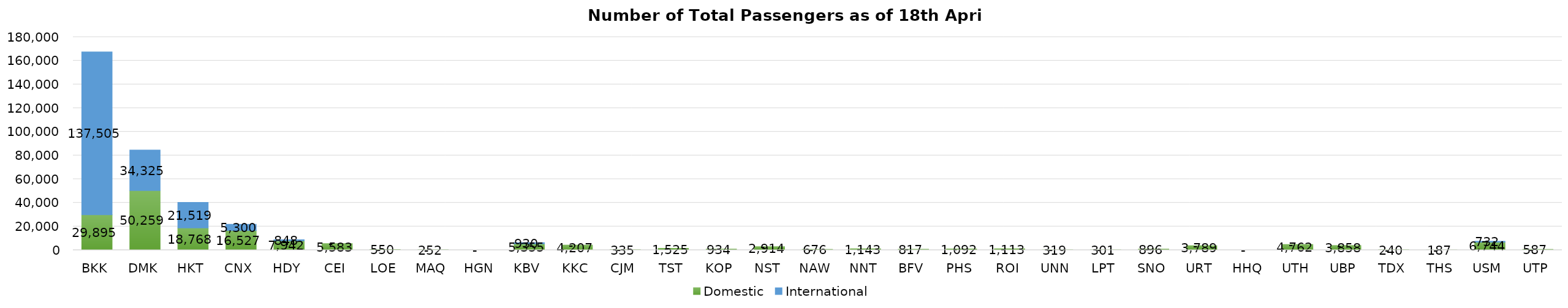
| Category | Domestic | International |
|---|---|---|
| BKK | 29895 | 137505 |
| DMK | 50259 | 34325 |
| HKT | 18768 | 21519 |
| CNX | 16527 | 5300 |
| HDY | 7942 | 848 |
| CEI | 5583 | 0 |
| LOE | 550 | 0 |
| MAQ | 252 | 0 |
| HGN | 0 | 0 |
| KBV | 5355 | 930 |
| KKC | 4207 | 0 |
| CJM | 335 | 0 |
| TST | 1525 | 0 |
| KOP | 934 | 0 |
| NST | 2914 | 0 |
| NAW | 676 | 0 |
| NNT | 1143 | 0 |
| BFV | 817 | 0 |
| PHS | 1092 | 0 |
| ROI | 1113 | 0 |
| UNN | 319 | 0 |
| LPT | 301 | 0 |
| SNO | 896 | 0 |
| URT | 3789 | 0 |
| HHQ | 0 | 0 |
| UTH | 4762 | 0 |
| UBP | 3858 | 0 |
| TDX | 240 | 0 |
| THS | 187 | 0 |
| USM | 6744 | 732 |
| UTP | 587 | 0 |